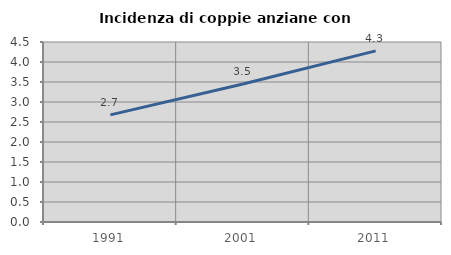
| Category | Incidenza di coppie anziane con figli |
|---|---|
| 1991.0 | 2.678 |
| 2001.0 | 3.451 |
| 2011.0 | 4.277 |